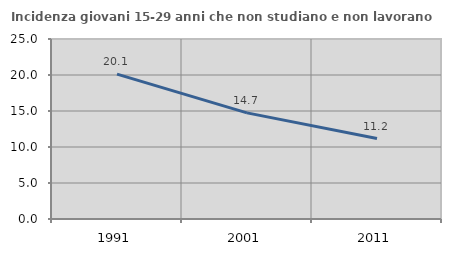
| Category | Incidenza giovani 15-29 anni che non studiano e non lavorano  |
|---|---|
| 1991.0 | 20.123 |
| 2001.0 | 14.739 |
| 2011.0 | 11.169 |